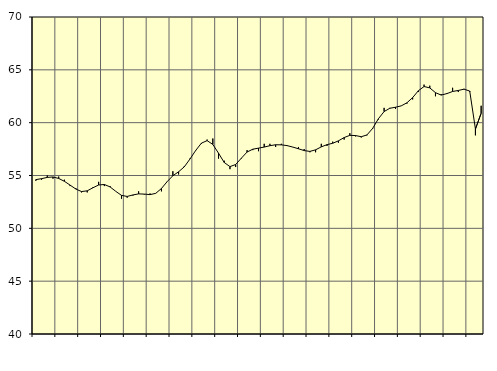
| Category | Piggar | Samtliga fast anställda (inkl. fast anställda utomlands) |
|---|---|---|
| nan | 54.5 | 54.61 |
| 1.0 | 54.6 | 54.7 |
| 1.0 | 55 | 54.82 |
| 1.0 | 54.7 | 54.86 |
| nan | 54.9 | 54.72 |
| 2.0 | 54.6 | 54.45 |
| 2.0 | 54 | 54.09 |
| 2.0 | 53.8 | 53.72 |
| nan | 53.4 | 53.48 |
| 3.0 | 53.4 | 53.55 |
| 3.0 | 53.9 | 53.84 |
| 3.0 | 54.4 | 54.1 |
| nan | 54 | 54.15 |
| 4.0 | 54 | 53.92 |
| 4.0 | 53.5 | 53.5 |
| 4.0 | 52.8 | 53.12 |
| nan | 52.9 | 53.02 |
| 5.0 | 53.1 | 53.16 |
| 5.0 | 53.5 | 53.26 |
| 5.0 | 53.2 | 53.24 |
| nan | 53.3 | 53.19 |
| 6.0 | 53.3 | 53.31 |
| 6.0 | 53.5 | 53.77 |
| 6.0 | 54.4 | 54.42 |
| nan | 55.4 | 54.98 |
| 7.0 | 55.1 | 55.35 |
| 7.0 | 55.9 | 55.82 |
| 7.0 | 56.6 | 56.56 |
| nan | 57.4 | 57.37 |
| 8.0 | 58 | 58.06 |
| 8.0 | 58.4 | 58.3 |
| 8.0 | 58.5 | 57.94 |
| nan | 56.6 | 57.11 |
| 9.0 | 56.4 | 56.23 |
| 9.0 | 55.6 | 55.84 |
| 9.0 | 55.8 | 56.04 |
| nan | 56.6 | 56.64 |
| 10.0 | 57.4 | 57.22 |
| 10.0 | 57.4 | 57.49 |
| 10.0 | 57.3 | 57.59 |
| nan | 58 | 57.69 |
| 11.0 | 58 | 57.82 |
| 11.0 | 57.7 | 57.91 |
| 11.0 | 58 | 57.9 |
| nan | 57.8 | 57.83 |
| 12.0 | 57.7 | 57.69 |
| 12.0 | 57.7 | 57.53 |
| 12.0 | 57.5 | 57.36 |
| nan | 57.2 | 57.28 |
| 13.0 | 57.2 | 57.43 |
| 13.0 | 58 | 57.71 |
| 13.0 | 57.8 | 57.92 |
| nan | 58.2 | 58.05 |
| 14.0 | 58.1 | 58.28 |
| 14.0 | 58.4 | 58.59 |
| 14.0 | 59 | 58.8 |
| nan | 58.7 | 58.78 |
| 15.0 | 58.6 | 58.67 |
| 15.0 | 58.8 | 58.84 |
| 15.0 | 59.4 | 59.46 |
| nan | 60.3 | 60.37 |
| 16.0 | 61.4 | 61.05 |
| 16.0 | 61.4 | 61.36 |
| 16.0 | 61.3 | 61.46 |
| nan | 61.6 | 61.59 |
| 17.0 | 61.8 | 61.88 |
| 17.0 | 62.2 | 62.37 |
| 17.0 | 62.9 | 63.02 |
| nan | 63.6 | 63.42 |
| 18.0 | 63.5 | 63.29 |
| 18.0 | 62.5 | 62.84 |
| 18.0 | 62.7 | 62.61 |
| nan | 62.8 | 62.75 |
| 19.0 | 63.3 | 62.95 |
| 19.0 | 62.9 | 63.05 |
| 19.0 | 63.2 | 63.17 |
| nan | 62.9 | 62.99 |
| 20.0 | 58.8 | 59.4 |
| 20.0 | 61.6 | 60.89 |